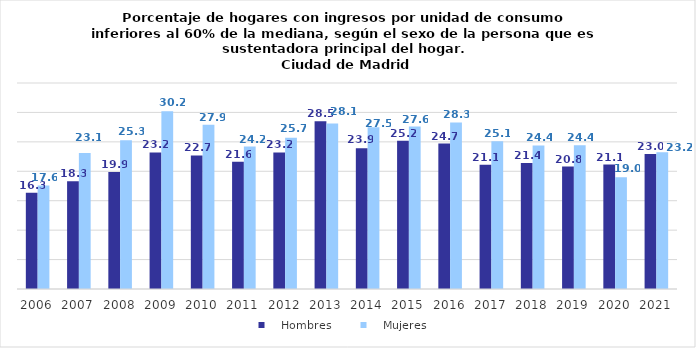
| Category |    Hombres |    Mujeres |
|---|---|---|
| 2006.0 | 16.338 | 17.587 |
| 2007.0 | 18.324 | 23.093 |
| 2008.0 | 19.861 | 25.264 |
| 2009.0 | 23.2 | 30.2 |
| 2010.0 | 22.7 | 27.9 |
| 2011.0 | 21.6 | 24.2 |
| 2012.0 | 23.2 | 25.7 |
| 2013.0 | 28.5 | 28.1 |
| 2014.0 | 23.9 | 27.5 |
| 2015.0 | 25.2 | 27.6 |
| 2016.0 | 24.7 | 28.3 |
| 2017.0 | 21.1 | 25.1 |
| 2018.0 | 21.4 | 24.4 |
| 2019.0 | 20.801 | 24.443 |
| 2020.0 | 21.148 | 18.971 |
| 2021.0 | 22.956 | 23.219 |